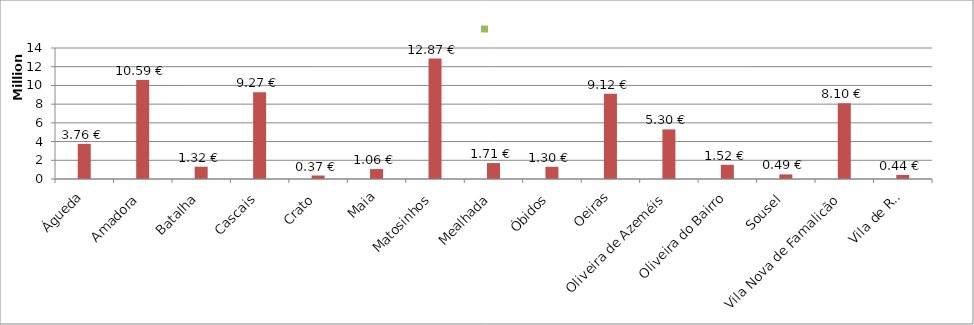
| Category | Nº de AE/E | Financiamento | Series 2 |
|---|---|---|---|
| Águeda | 4 | 3757188 | 3.8 |
| Amadora | 12 | 10585071 | 10.6 |
| Batalha | 1 | 1315428 | 1.3 |
| Cascais | 12 | 9268458 | 9.3 |
| Crato | 1 | 373833 | 0.4 |
| Maia | 1 | 1061972 | 1.1 |
| Matosinhos | 12 | 12868793 | 12.9 |
| Mealhada | 1 | 1705952 | 1.7 |
| Óbidos | 1 | 1304395 | 1.3 |
| Oeiras | 11 | 9123154 | 9.1 |
| Oliveira de Azeméis | 5 | 5298471 | 5.3 |
| Oliveira do Bairro | 1 | 1517240 | 1.5 |
| Sousel | 1 | 491808 | 0.5 |
| Vila Nova de Famalicão | 7 | 8102046 | 8.1 |
| Vila de Rei | 1 | 439513 | 0.4 |